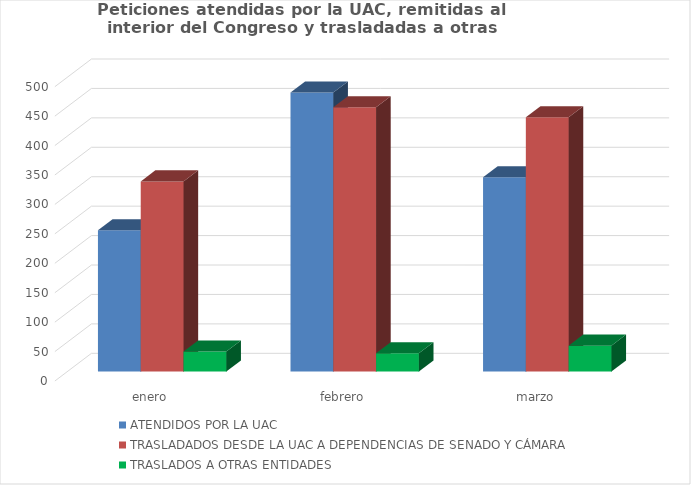
| Category | ATENDIDOS POR LA UAC | TRASLADADOS DESDE LA UAC A DEPENDENCIAS DE SENADO Y CÁMARA | TRASLADOS A OTRAS ENTIDADES  |
|---|---|---|---|
| enero | 240 | 323 | 34 |
| febrero | 474 | 449 | 31 |
| marzo | 330 | 432 | 44 |